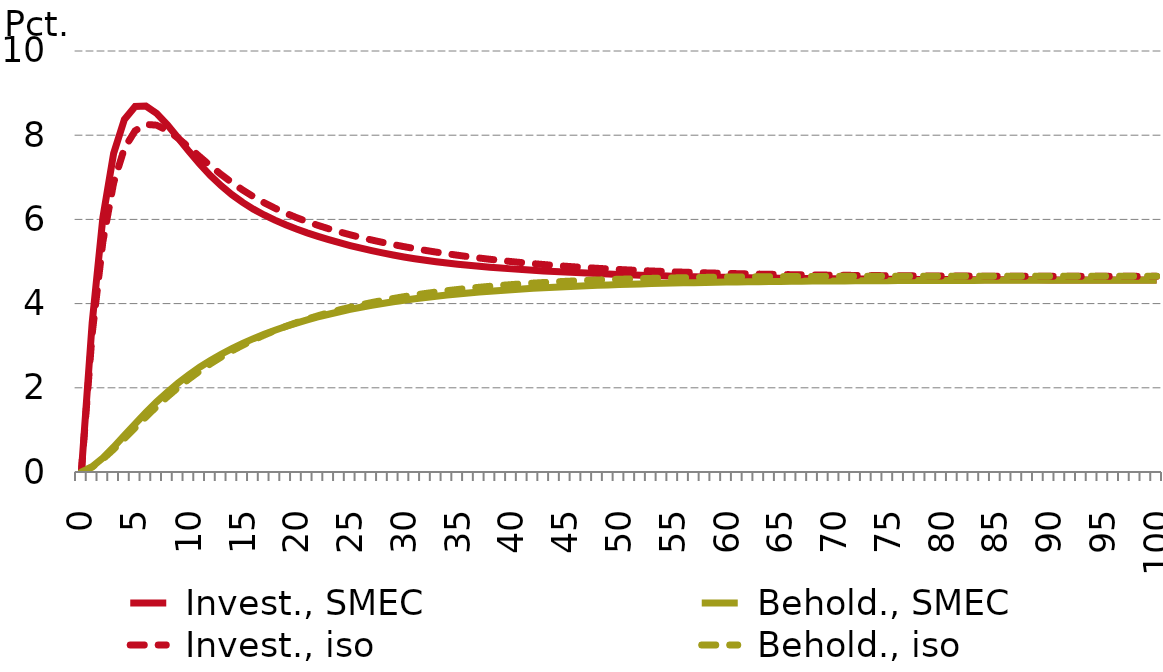
| Category |  Invest., SMEC |  Behold., SMEC |  Invest., iso |  Behold., iso |
|---|---|---|---|---|
| 0.0 | 0 | 0 | 0 | 0 |
| nan | 3.534 | 0.126 | 3.27 | 0.116 |
| nan | 6.044 | 0.336 | 5.47 | 0.306 |
| nan | 7.569 | 0.592 | 6.866 | 0.539 |
| nan | 8.373 | 0.868 | 7.69 | 0.792 |
| 5.0 | 8.684 | 1.145 | 8.105 | 1.052 |
| nan | 8.693 | 1.413 | 8.257 | 1.308 |
| nan | 8.519 | 1.666 | 8.238 | 1.554 |
| nan | 8.247 | 1.9 | 8.113 | 1.787 |
| nan | 7.934 | 2.114 | 7.928 | 2.006 |
| 10.0 | 7.616 | 2.31 | 7.714 | 2.209 |
| nan | 7.315 | 2.488 | 7.492 | 2.396 |
| nan | 7.042 | 2.65 | 7.273 | 2.57 |
| nan | 6.799 | 2.797 | 7.066 | 2.729 |
| nan | 6.587 | 2.932 | 6.874 | 2.877 |
| 15.0 | 6.404 | 3.055 | 6.699 | 3.012 |
| nan | 6.244 | 3.168 | 6.54 | 3.137 |
| nan | 6.104 | 3.272 | 6.396 | 3.252 |
| nan | 5.981 | 3.367 | 6.266 | 3.359 |
| nan | 5.872 | 3.456 | 6.149 | 3.457 |
| 20.0 | 5.772 | 3.537 | 6.043 | 3.548 |
| nan | 5.681 | 3.613 | 5.947 | 3.633 |
| nan | 5.597 | 3.682 | 5.859 | 3.711 |
| nan | 5.519 | 3.747 | 5.778 | 3.783 |
| nan | 5.447 | 3.807 | 5.703 | 3.851 |
| 25.0 | 5.379 | 3.862 | 5.634 | 3.913 |
| nan | 5.316 | 3.912 | 5.57 | 3.971 |
| nan | 5.257 | 3.959 | 5.511 | 4.025 |
| nan | 5.203 | 4.003 | 5.455 | 4.075 |
| nan | 5.154 | 4.043 | 5.402 | 4.121 |
| 30.0 | 5.108 | 4.08 | 5.353 | 4.164 |
| nan | 5.067 | 4.114 | 5.307 | 4.204 |
| nan | 5.029 | 4.146 | 5.264 | 4.241 |
| nan | 4.994 | 4.176 | 5.223 | 4.275 |
| nan | 4.963 | 4.203 | 5.185 | 4.306 |
| 35.0 | 4.935 | 4.228 | 5.148 | 4.336 |
| nan | 4.909 | 4.252 | 5.114 | 4.363 |
| nan | 4.885 | 4.274 | 5.082 | 4.388 |
| nan | 4.863 | 4.294 | 5.052 | 4.411 |
| nan | 4.843 | 4.313 | 5.024 | 4.432 |
| 40.0 | 4.825 | 4.331 | 4.998 | 4.451 |
| nan | 4.808 | 4.348 | 4.973 | 4.469 |
| nan | 4.791 | 4.363 | 4.95 | 4.486 |
| nan | 4.776 | 4.377 | 4.928 | 4.501 |
| nan | 4.762 | 4.391 | 4.907 | 4.515 |
| 45.0 | 4.749 | 4.403 | 4.888 | 4.528 |
| nan | 4.736 | 4.414 | 4.87 | 4.54 |
| nan | 4.724 | 4.425 | 4.854 | 4.551 |
| nan | 4.713 | 4.435 | 4.838 | 4.561 |
| nan | 4.703 | 4.444 | 4.824 | 4.57 |
| 50.0 | 4.693 | 4.453 | 4.81 | 4.578 |
| nan | 4.684 | 4.461 | 4.797 | 4.586 |
| nan | 4.675 | 4.468 | 4.786 | 4.593 |
| nan | 4.667 | 4.475 | 4.775 | 4.599 |
| nan | 4.66 | 4.481 | 4.765 | 4.605 |
| 55.0 | 4.653 | 4.487 | 4.755 | 4.61 |
| nan | 4.646 | 4.493 | 4.746 | 4.614 |
| nan | 4.64 | 4.498 | 4.738 | 4.619 |
| nan | 4.634 | 4.503 | 4.731 | 4.623 |
| nan | 4.629 | 4.507 | 4.724 | 4.626 |
| 60.0 | 4.624 | 4.511 | 4.717 | 4.629 |
| nan | 4.619 | 4.515 | 4.711 | 4.632 |
| nan | 4.615 | 4.518 | 4.706 | 4.635 |
| nan | 4.611 | 4.521 | 4.701 | 4.637 |
| nan | 4.607 | 4.524 | 4.696 | 4.639 |
| 65.0 | 4.604 | 4.527 | 4.692 | 4.641 |
| nan | 4.6 | 4.529 | 4.688 | 4.642 |
| nan | 4.597 | 4.532 | 4.684 | 4.644 |
| nan | 4.594 | 4.534 | 4.68 | 4.645 |
| nan | 4.592 | 4.536 | 4.677 | 4.646 |
| 70.0 | 4.589 | 4.538 | 4.674 | 4.647 |
| nan | 4.587 | 4.539 | 4.672 | 4.648 |
| nan | 4.585 | 4.541 | 4.669 | 4.649 |
| nan | 4.583 | 4.542 | 4.667 | 4.649 |
| nan | 4.581 | 4.544 | 4.665 | 4.65 |
| 75.0 | 4.579 | 4.545 | 4.663 | 4.65 |
| nan | 4.577 | 4.546 | 4.662 | 4.651 |
| nan | 4.576 | 4.547 | 4.66 | 4.651 |
| nan | 4.574 | 4.548 | 4.659 | 4.651 |
| nan | 4.573 | 4.549 | 4.657 | 4.651 |
| 80.0 | 4.572 | 4.55 | 4.656 | 4.652 |
| nan | 4.571 | 4.55 | 4.655 | 4.652 |
| nan | 4.57 | 4.551 | 4.654 | 4.652 |
| nan | 4.569 | 4.552 | 4.653 | 4.652 |
| nan | 4.568 | 4.552 | 4.652 | 4.652 |
| 85.0 | 4.567 | 4.553 | 4.652 | 4.652 |
| nan | 4.566 | 4.553 | 4.651 | 4.652 |
| nan | 4.565 | 4.554 | 4.65 | 4.652 |
| nan | 4.565 | 4.554 | 4.65 | 4.652 |
| nan | 4.564 | 4.554 | 4.649 | 4.652 |
| 90.0 | 4.563 | 4.555 | 4.649 | 4.652 |
| nan | 4.563 | 4.555 | 4.649 | 4.651 |
| nan | 4.562 | 4.555 | 4.648 | 4.651 |
| nan | 4.562 | 4.555 | 4.648 | 4.651 |
| nan | 4.561 | 4.556 | 4.648 | 4.651 |
| 95.0 | 4.561 | 4.556 | 4.647 | 4.651 |
| nan | 4.561 | 4.556 | 4.647 | 4.651 |
| nan | 4.56 | 4.556 | 4.647 | 4.651 |
| nan | 4.56 | 4.556 | 4.647 | 4.651 |
| nan | 4.56 | 4.556 | 4.647 | 4.65 |
| 100.0 | 4.559 | 4.556 | 4.647 | 4.65 |